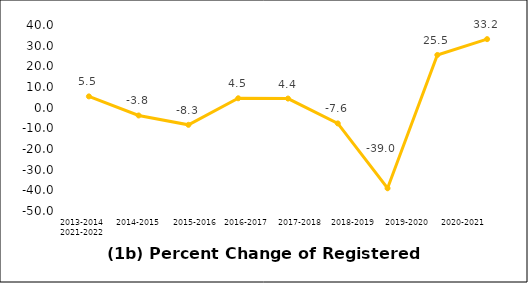
| Category | Series 0 |
|---|---|
| 2013-2014 | 5.457 |
| 2014-2015 | -3.773 |
| 2015-2016 | -8.302 |
| 2016-2017 | 4.547 |
| 2017-2018 | 4.405 |
| 2018-2019 | -7.622 |
| 2019-2020 | -39.009 |
| 2020-2021 | 25.501 |
| 2021-2022 | 33.16 |